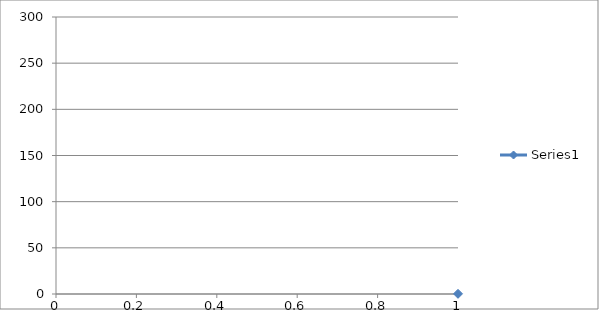
| Category | Series 0 |
|---|---|
| 0 | 0.199 |
| 1 | 0.268 |
| 2 | 0.306 |
| 3 | 0.323 |
| 4 | 0.348 |
| 5 | 0.368 |
| 6 | 0.426 |
| 7 | 0.472 |
| 8 | 0.528 |
| 9 | 0.589 |
| 10 | 0.638 |
| 11 | 0.706 |
| 12 | 0.76 |
| 13 | 0.836 |
| 14 | 0.929 |
| 15 | 1.027 |
| 16 | 1.155 |
| 17 | 1.293 |
| 18 | 1.48 |
| 19 | 1.681 |
| 20 | 1.899 |
| 21 | 2.152 |
| 22 | 2.498 |
| 23 | 2.883 |
| 24 | 3.399 |
| 25 | 3.999 |
| 26 | 4.793 |
| 27 | 6.226 |
| 28 | 7.656 |
| 29 | 9.358 |
| 30 | 11.908 |
| 31 | 13.141 |
| 32 | 14.373 |
| 33 | 15.82 |
| 34 | 17.404 |
| 35 | 18.965 |
| 36 | 21.016 |
| 37 | 23.518 |
| 38 | 26.265 |
| 39 | 28.958 |
| 40 | 31.91 |
| 41 | 35.84 |
| 42 | 39.856 |
| 43 | 44.408 |
| 44 | 49.217 |
| 45 | 54.785 |
| 46 | 60.794 |
| 47 | 67.765 |
| 48 | 74.553 |
| 49 | 82.187 |
| 50 | 90.809 |
| 51 | 99.119 |
| 52 | 108.39 |
| 53 | 117.543 |
| 54 | 126.971 |
| 55 | 136.836 |
| 56 | 146.19 |
| 57 | 155.937 |
| 58 | 164.949 |
| 59 | 174.011 |
| 60 | 182.298 |
| 61 | 190.08 |
| 62 | 197.456 |
| 63 | 203.947 |
| 64 | 210.085 |
| 65 | 215.395 |
| 66 | 219.876 |
| 67 | 223.881 |
| 68 | 227.122 |
| 69 | 230.057 |
| 70 | 232.813 |
| 71 | 234.431 |
| 72 | 235.997 |
| 73 | 237.271 |
| 74 | 237.795 |
| 75 | 238.361 |
| 76 | 238.825 |
| 77 | 239.176 |
| 78 | 239.384 |
| 79 | 239.491 |
| 80 | 239.515 |
| 81 | 239.485 |
| 82 | 239.404 |
| 83 | 239.242 |
| 84 | 239.012 |
| 85 | 238.675 |
| 86 | 238.159 |
| 87 | 236.846 |
| 88 | 236.258 |
| 89 | 234.592 |
| 90 | 232.261 |
| 91 | 230.504 |
| 92 | 227.427 |
| 93 | 224.183 |
| 94 | 219.972 |
| 95 | 215.124 |
| 96 | 210.003 |
| 97 | 204.3 |
| 98 | 197.971 |
| 99 | 190.364 |
| 100 | 183.001 |
| 101 | 174.462 |
| 102 | 165.611 |
| 103 | 156.986 |
| 104 | 147.481 |
| 105 | 138.095 |
| 106 | 128.142 |
| 107 | 118.461 |
| 108 | 109.522 |
| 109 | 100.533 |
| 110 | 91.939 |
| 111 | 83.202 |
| 112 | 75.74 |
| 113 | 68.251 |
| 114 | 61.841 |
| 115 | 55.976 |
| 116 | 50.437 |
| 117 | 45.114 |
| 118 | 40.686 |
| 119 | 36.579 |
| 120 | 33.236 |
| 121 | 30.047 |
| 122 | 27.09 |
| 123 | 24.451 |
| 124 | 21.812 |
| 125 | 20.101 |
| 126 | 18.387 |
| 127 | 16.594 |
| 128 | 15.031 |
| 129 | 13.649 |
| 130 | 12.393 |
| 131 | 9.854 |
| 132 | 8.257 |
| 133 | 6.797 |
| 134 | 5.988 |
| 135 | 5.12 |
| 136 | 4.331 |
| 137 | 3.716 |
| 138 | 3.195 |
| 139 | 2.754 |
| 140 | 2.391 |
| 141 | 2.119 |
| 142 | 1.871 |
| 143 | 1.66 |
| 144 | 1.51 |
| 145 | 1.375 |
| 146 | 1.244 |
| 147 | 1.135 |
| 148 | 1.045 |
| 149 | 0.987 |
| 150 | 0.924 |
| 151 | 0.874 |
| 152 | 0.823 |
| 153 | 0.776 |
| 154 | 0.718 |
| 155 | 0.693 |
| 156 | 0.651 |
| 157 | 0.619 |
| 158 | 0.582 |
| 159 | 0.58 |
| 160 | 0.571 |